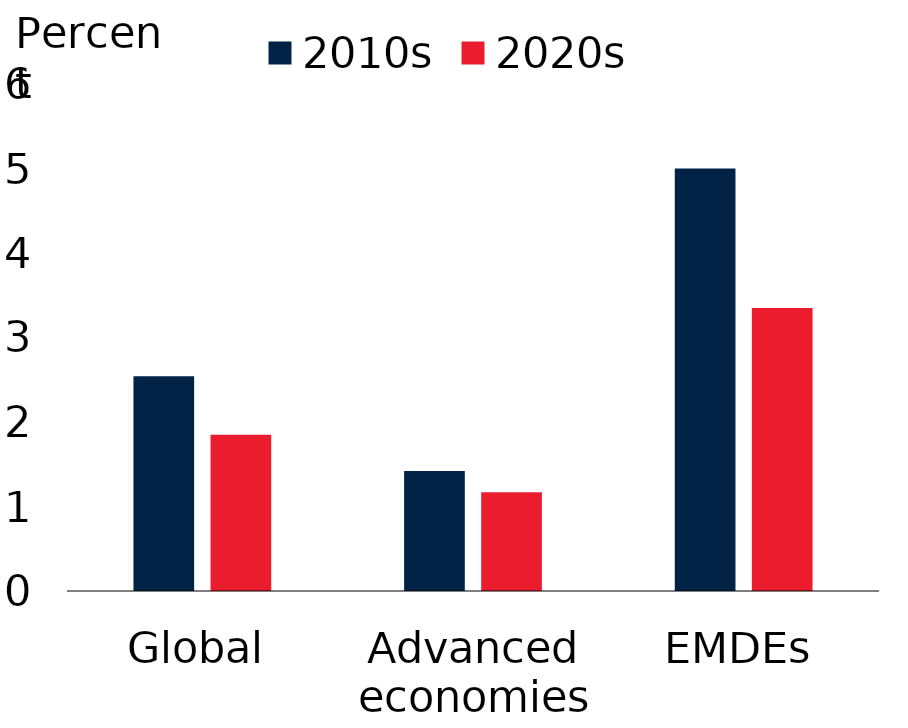
| Category | 2010s | 2020s |
|---|---|---|
| Global | 2.54 | 1.85 |
| Advanced
economies | 1.42 | 1.17 |
| EMDEs | 5 | 3.35 |